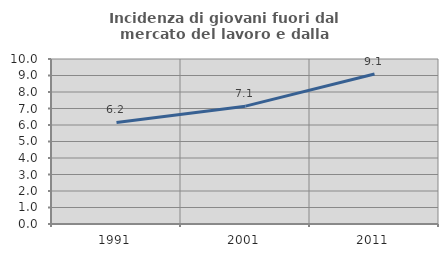
| Category | Incidenza di giovani fuori dal mercato del lavoro e dalla formazione  |
|---|---|
| 1991.0 | 6.157 |
| 2001.0 | 7.143 |
| 2011.0 | 9.087 |